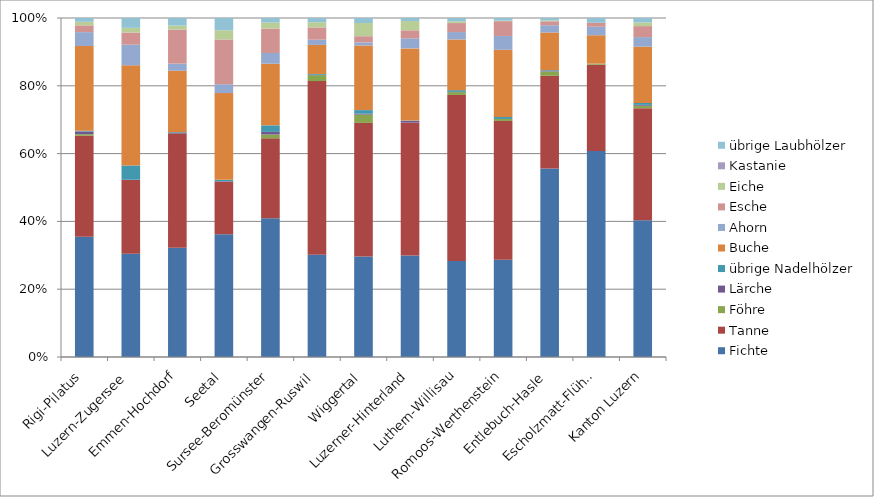
| Category | Fichte | Tanne | Föhre | Lärche | übrige Nadelhölzer | Buche | Ahorn | Esche | Eiche | Kastanie | übrige Laubhölzer |
|---|---|---|---|---|---|---|---|---|---|---|---|
| Rigi-Pilatus | 149 | 125.1 | 2 | 3.4 | 0.9 | 105 | 17.2 | 8.4 | 4.1 | 0.4 | 4.6 |
| Luzern-Zugersee | 104.1 | 74.3 | 0 | 0.2 | 14.4 | 100.9 | 20.8 | 12.2 | 4.8 | 0 | 9.9 |
| Emmen-Hochdorf | 112.9 | 117.8 | 0 | 0.6 | 0.9 | 63.4 | 7.4 | 35.1 | 4.2 | 0 | 7.8 |
| Seetal | 159.5 | 68.7 | 0 | 0.3 | 1.9 | 112.8 | 11.6 | 58.2 | 12 | 0 | 15.9 |
| Sursee-Beromünster | 145.9 | 84.1 | 4 | 2.8 | 6.9 | 64.8 | 11.3 | 25.7 | 6.2 | 0.1 | 4.8 |
| Grosswangen-Ruswil | 120.7 | 204.7 | 7 | 0.4 | 1 | 34.3 | 6.1 | 14.5 | 6.1 | 0 | 5 |
| Wiggertal | 112.2 | 149 | 9.3 | 1 | 4 | 72.1 | 3.4 | 7 | 14.7 | 0 | 5.6 |
| Luzerner-Hinterland | 122.9 | 160.9 | 0 | 2.3 | 0.3 | 87.4 | 12.2 | 9.7 | 11.2 | 0 | 3.7 |
| Luthern-Willisau | 119.4 | 206.5 | 3.5 | 0.3 | 2.2 | 63 | 9.2 | 11.2 | 2.1 | 0 | 4.2 |
| Romoos-Werthenstein | 120.9 | 172.3 | 2.5 | 0 | 2.5 | 83.4 | 17.2 | 18.4 | 0.6 | 0 | 3.3 |
| Entlebuch-Hasle | 218.1 | 107.3 | 5 | 0.5 | 1.1 | 43.6 | 8.4 | 4.6 | 0.9 | 0.1 | 2.8 |
| Escholzmatt-Flühli | 240.3 | 100.6 | 1.3 | 0 | 0 | 33.1 | 9.9 | 4.6 | 0 | 0 | 5.6 |
| Kanton Luzern | 160.4 | 131.4 | 2.9 | 1 | 2.2 | 66 | 11.3 | 12.9 | 4.1 | 0.1 | 5.3 |